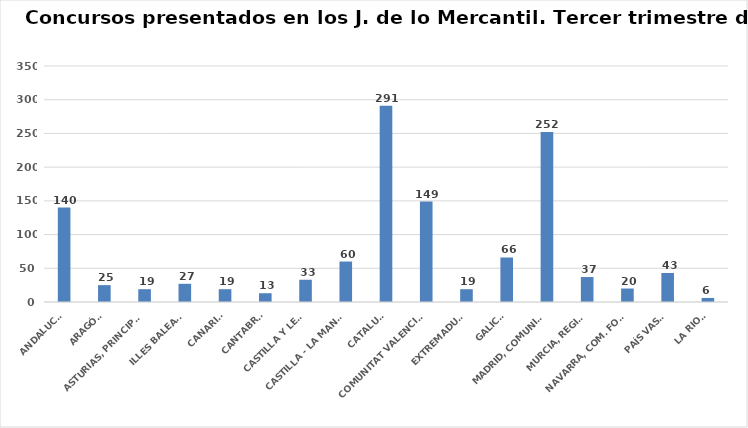
| Category | Series 0 |
|---|---|
| ANDALUCÍA | 140 |
| ARAGÓN | 25 |
| ASTURIAS, PRINCIPADO | 19 |
| ILLES BALEARS | 27 |
| CANARIAS | 19 |
| CANTABRIA | 13 |
| CASTILLA Y LEÓN | 33 |
| CASTILLA - LA MANCHA | 60 |
| CATALUÑA | 291 |
| COMUNITAT VALENCIANA | 149 |
| EXTREMADURA | 19 |
| GALICIA | 66 |
| MADRID, COMUNIDAD | 252 |
| MURCIA, REGIÓN | 37 |
| NAVARRA, COM. FORAL | 20 |
| PAÍS VASCO | 43 |
| LA RIOJA | 6 |